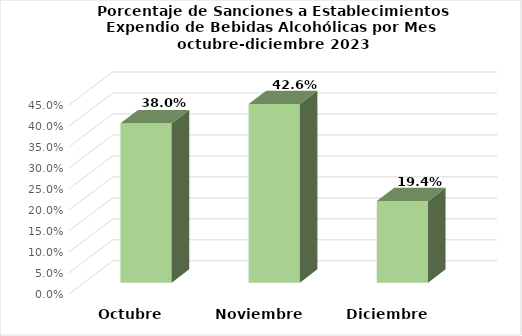
| Category | Series 0 |
|---|---|
| Octubre | 0.38 |
| Noviembre | 0.426 |
| Diciembre | 0.194 |